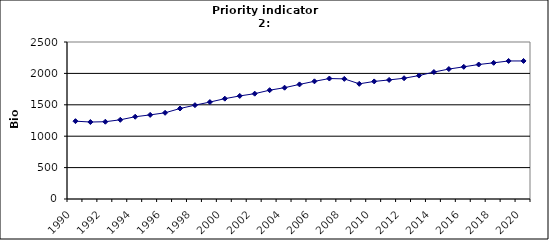
| Category | GDP, Bio Euro (EC95) |
|---|---|
| 1990 | 1239.333 |
| 1991 | 1225.662 |
| 1992 | 1230.578 |
| 1993 | 1261.217 |
| 1994 | 1309.723 |
| 1995 | 1339.241 |
| 1996 | 1372.609 |
| 1997 | 1440.901 |
| 1998 | 1494.326 |
| 1999 | 1543.567 |
| 2000 | 1597.688 |
| 2001 | 1641.31 |
| 2002 | 1677.07 |
| 2003 | 1732.78 |
| 2004 | 1772.396 |
| 2005 | 1824.783 |
| 2006 | 1873.939 |
| 2007 | 1918.175 |
| 2008 | 1912.827 |
| 2009 | 1834.135 |
| 2010 | 1872.176 |
| 2011 | 1896.059 |
| 2012 | 1923.18 |
| 2013 | 1965.223 |
| 2014 | 2021.482 |
| 2015 | 2069.251 |
| 2016 | 2104.892 |
| 2017 | 2141.523 |
| 2018 | 2168.348 |
| 2019 | 2198.072 |
| 2020 | 2198.072 |